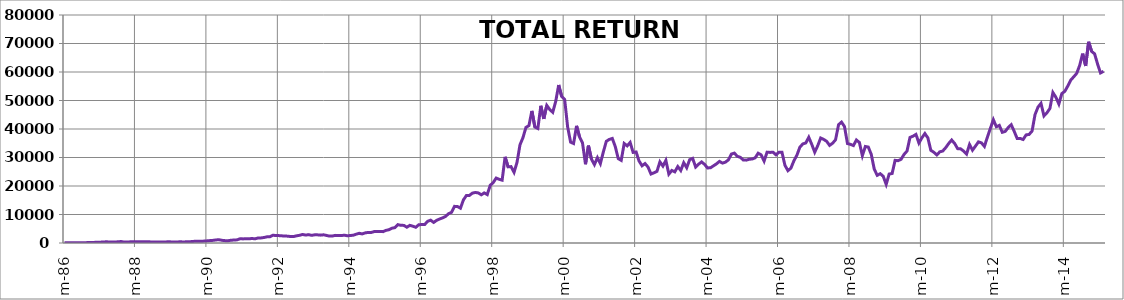
| Category | TOTAL RETURN MICROSOFT |
|---|---|
| 1986-03-13 | 100 |
| 1986-04-13 | 102.68 |
| 1986-05-13 | 115.18 |
| 1986-06-13 | 112.5 |
| 1986-07-13 | 100 |
| 1986-08-13 | 106.25 |
| 1986-09-13 | 100.89 |
| 1986-10-13 | 118.75 |
| 1986-11-13 | 150.45 |
| 1986-12-13 | 168.75 |
| 1987-01-13 | 214.29 |
| 1987-02-13 | 271.43 |
| 1987-03-13 | 295.54 |
| 1987-04-13 | 330.36 |
| 1987-05-13 | 434.82 |
| 1987-06-13 | 350.89 |
| 1987-07-13 | 354.46 |
| 1987-08-13 | 367.86 |
| 1987-09-13 | 415.18 |
| 1987-10-13 | 523.21 |
| 1987-11-13 | 344.64 |
| 1987-12-13 | 342.86 |
| 1988-01-13 | 405.36 |
| 1988-02-13 | 394.64 |
| 1988-03-13 | 446.43 |
| 1988-04-13 | 407.14 |
| 1988-05-13 | 405.36 |
| 1988-06-13 | 445.54 |
| 1988-07-13 | 476.79 |
| 1988-08-13 | 371.43 |
| 1988-09-13 | 385.71 |
| 1988-10-13 | 367.86 |
| 1988-11-13 | 340.18 |
| 1988-12-13 | 341.07 |
| 1989-01-13 | 378.57 |
| 1989-02-13 | 437.5 |
| 1989-03-13 | 376.79 |
| 1989-04-13 | 348.21 |
| 1989-05-13 | 387.5 |
| 1989-06-13 | 408.93 |
| 1989-07-13 | 378.57 |
| 1989-08-13 | 412.5 |
| 1989-09-13 | 444.64 |
| 1989-10-13 | 525 |
| 1989-11-13 | 629.46 |
| 1989-12-13 | 571.43 |
| 1990-01-13 | 615.18 |
| 1990-02-13 | 676.79 |
| 1990-03-13 | 758.93 |
| 1990-04-13 | 862.5 |
| 1990-05-13 | 935.71 |
| 1990-06-13 | 1092.86 |
| 1990-07-13 | 1119.64 |
| 1990-08-13 | 928.57 |
| 1990-09-13 | 821.43 |
| 1990-10-13 | 814.29 |
| 1990-11-13 | 980.36 |
| 1990-12-13 | 1039.29 |
| 1991-01-13 | 1114.29 |
| 1991-02-13 | 1507.14 |
| 1991-03-13 | 1435.71 |
| 1991-04-13 | 1532.14 |
| 1991-05-13 | 1473.21 |
| 1991-06-13 | 1585.71 |
| 1991-07-13 | 1457.07 |
| 1991-08-13 | 1767.77 |
| 1991-09-13 | 1778.48 |
| 1991-10-13 | 1920.44 |
| 1991-11-13 | 2164.18 |
| 1991-12-13 | 2185.61 |
| 1992-01-13 | 2723.97 |
| 1992-02-13 | 2624.87 |
| 1992-03-13 | 2592.73 |
| 1992-04-13 | 2517.73 |
| 1992-05-13 | 2415.95 |
| 1992-06-13 | 2410.59 |
| 1992-07-13 | 2249.77 |
| 1992-08-13 | 2277.9 |
| 1992-09-13 | 2531 |
| 1992-10-13 | 2707.76 |
| 1992-11-13 | 2997.02 |
| 1992-12-13 | 2776.06 |
| 1993-01-13 | 2932.74 |
| 1993-02-13 | 2687.68 |
| 1993-03-13 | 2860.43 |
| 1993-04-13 | 2856.41 |
| 1993-05-13 | 2755.97 |
| 1993-06-13 | 2872.48 |
| 1993-07-13 | 2659.56 |
| 1993-08-13 | 2418.51 |
| 1993-09-13 | 2454.67 |
| 1993-10-13 | 2675.63 |
| 1993-11-13 | 2631.43 |
| 1993-12-13 | 2615.36 |
| 1994-01-13 | 2743.92 |
| 1994-02-13 | 2531 |
| 1994-03-13 | 2627.42 |
| 1994-04-13 | 2727.85 |
| 1994-05-13 | 3101.48 |
| 1994-06-13 | 3398.77 |
| 1994-07-13 | 3181.82 |
| 1994-08-13 | 3551.43 |
| 1994-09-13 | 3700.08 |
| 1994-10-13 | 3679.99 |
| 1994-11-13 | 4001.39 |
| 1994-12-13 | 4033.53 |
| 1995-01-13 | 4033.53 |
| 1995-02-13 | 3985.32 |
| 1995-03-13 | 4435.27 |
| 1995-04-13 | 4660.25 |
| 1995-05-13 | 5190.55 |
| 1995-06-13 | 5391.42 |
| 1995-07-13 | 6435.96 |
| 1995-08-13 | 6202.95 |
| 1995-09-13 | 6178.84 |
| 1995-10-13 | 5544.09 |
| 1995-11-13 | 6190.9 |
| 1995-12-13 | 5897.62 |
| 1996-01-13 | 5511.95 |
| 1996-02-13 | 6403.82 |
| 1996-03-13 | 6484.17 |
| 1996-04-13 | 6500.24 |
| 1996-05-13 | 7625.13 |
| 1996-06-13 | 8010.8 |
| 1996-07-13 | 7223.38 |
| 1996-08-13 | 7938.49 |
| 1996-09-13 | 8420.59 |
| 1996-10-13 | 8814.3 |
| 1996-11-13 | 9320.5 |
| 1996-12-13 | 10284.68 |
| 1997-01-13 | 10766.78 |
| 1997-02-13 | 12855.86 |
| 1997-03-13 | 12807.64 |
| 1997-04-13 | 12213.06 |
| 1997-05-13 | 15137.77 |
| 1997-06-13 | 16664.4 |
| 1997-07-13 | 16680.47 |
| 1997-08-13 | 17492 |
| 1997-09-13 | 17733.05 |
| 1997-10-13 | 17580.38 |
| 1997-11-13 | 16913.48 |
| 1997-12-13 | 17580.38 |
| 1998-01-13 | 16985.8 |
| 1998-02-13 | 20247.97 |
| 1998-03-13 | 21180.02 |
| 1998-04-13 | 22787 |
| 1998-05-13 | 22353.12 |
| 1998-06-13 | 22047.79 |
| 1998-07-13 | 30227.33 |
| 1998-08-13 | 26724.11 |
| 1998-09-13 | 26804.46 |
| 1998-10-13 | 24795.73 |
| 1998-11-13 | 28282.88 |
| 1998-12-13 | 34453.7 |
| 1999-01-13 | 36976.66 |
| 1999-02-13 | 40560.23 |
| 1999-03-13 | 41186.95 |
| 1999-04-13 | 46345.36 |
| 1999-05-13 | 40688.79 |
| 1999-06-13 | 40174.55 |
| 1999-07-13 | 48145.18 |
| 1999-08-13 | 43549.21 |
| 1999-09-13 | 48273.74 |
| 1999-10-13 | 46827.46 |
| 1999-11-13 | 45863.27 |
| 1999-12-13 | 49687.89 |
| 2000-01-13 | 55440.88 |
| 2000-02-13 | 51391.29 |
| 2000-03-13 | 50394.96 |
| 2000-04-13 | 40753.07 |
| 2000-05-13 | 35385.75 |
| 2000-06-13 | 34903.65 |
| 2000-07-13 | 41106.6 |
| 2000-08-13 | 37249.84 |
| 2000-09-13 | 35096.49 |
| 2000-10-13 | 27640.09 |
| 2000-11-13 | 34164.44 |
| 2000-12-13 | 29439.91 |
| 2001-01-13 | 27511.53 |
| 2001-02-13 | 29922 |
| 2001-03-13 | 27865.07 |
| 2001-04-13 | 31975.08 |
| 2001-05-13 | 35687.86 |
| 2001-06-13 | 36351.21 |
| 2001-07-13 | 36685.47 |
| 2001-08-13 | 33852.04 |
| 2001-09-13 | 29609.6 |
| 2001-10-13 | 28992.52 |
| 2001-11-13 | 34916.5 |
| 2001-12-13 | 34078.3 |
| 2002-01-13 | 35281.61 |
| 2002-02-13 | 31789.96 |
| 2002-03-13 | 31933.94 |
| 2002-04-13 | 28761.12 |
| 2002-05-13 | 27095 |
| 2002-06-13 | 27881.77 |
| 2002-07-13 | 26668.18 |
| 2002-08-13 | 24194.71 |
| 2002-09-13 | 24636.96 |
| 2002-10-13 | 25130.63 |
| 2002-11-13 | 28468 |
| 2002-12-13 | 26997.3 |
| 2003-01-13 | 28997.67 |
| 2003-02-13 | 24163.86 |
| 2003-03-13 | 25455.06 |
| 2003-04-13 | 24970.11 |
| 2003-05-13 | 26817.06 |
| 2003-06-13 | 25434.42 |
| 2003-07-13 | 28178.04 |
| 2003-08-13 | 26414.65 |
| 2003-09-13 | 29241.85 |
| 2003-10-13 | 29695.86 |
| 2003-11-13 | 26653.41 |
| 2003-12-13 | 27649.41 |
| 2004-01-13 | 28458.66 |
| 2004-02-13 | 27587.17 |
| 2004-03-13 | 26331.79 |
| 2004-04-13 | 26404.42 |
| 2004-05-13 | 27078.79 |
| 2004-06-13 | 27773.91 |
| 2004-07-13 | 28635.04 |
| 2004-08-13 | 28033.29 |
| 2004-09-13 | 28354.95 |
| 2004-10-13 | 29166.58 |
| 2004-11-13 | 31185.23 |
| 2004-12-13 | 31543.46 |
| 2005-01-13 | 30409.04 |
| 2005-02-13 | 30061.77 |
| 2005-03-13 | 29132.74 |
| 2005-04-13 | 29074.68 |
| 2005-05-13 | 29376.57 |
| 2005-06-13 | 29480.42 |
| 2005-07-13 | 29888.08 |
| 2005-08-13 | 31507.12 |
| 2005-09-13 | 30934.16 |
| 2005-10-13 | 28726.24 |
| 2005-11-13 | 31868.73 |
| 2005-12-13 | 31785.81 |
| 2006-01-13 | 31855.98 |
| 2006-02-13 | 30918.7 |
| 2006-03-13 | 31868.59 |
| 2006-04-13 | 31821.58 |
| 2006-05-13 | 27237.02 |
| 2006-06-13 | 25383.94 |
| 2006-07-13 | 26269.01 |
| 2006-08-13 | 28829.83 |
| 2006-09-13 | 30771.06 |
| 2006-10-13 | 33601.81 |
| 2006-11-13 | 34762.53 |
| 2006-12-13 | 35119.15 |
| 2007-01-13 | 37092.01 |
| 2007-02-13 | 34620.01 |
| 2007-03-13 | 31865.18 |
| 2007-04-13 | 34119.12 |
| 2007-05-13 | 36838.17 |
| 2007-06-13 | 36359.18 |
| 2007-07-13 | 35677.21 |
| 2007-08-13 | 34253.47 |
| 2007-09-13 | 35010.98 |
| 2007-10-13 | 36223.65 |
| 2007-11-13 | 41506.51 |
| 2007-12-13 | 42421.91 |
| 2008-01-13 | 40844.04 |
| 2008-02-13 | 34881.85 |
| 2008-03-13 | 34606.94 |
| 2008-04-13 | 34195.82 |
| 2008-05-13 | 36142.61 |
| 2008-06-13 | 35280.91 |
| 2008-07-13 | 30644.76 |
| 2008-08-13 | 33873.06 |
| 2008-09-13 | 33656.08 |
| 2008-10-13 | 31072.78 |
| 2008-11-13 | 25893.98 |
| 2008-12-13 | 23747.23 |
| 2009-01-13 | 24311.48 |
| 2009-02-13 | 23416.06 |
| 2009-03-13 | 20569.89 |
| 2009-04-13 | 24202.05 |
| 2009-05-13 | 24399.72 |
| 2009-06-13 | 29007.03 |
| 2009-07-13 | 28882.71 |
| 2009-08-13 | 29367.61 |
| 2009-09-13 | 31079.74 |
| 2009-10-13 | 32267.44 |
| 2009-11-13 | 37043.16 |
| 2009-12-13 | 37479.92 |
| 2010-01-13 | 38107.72 |
| 2010-02-13 | 35069.15 |
| 2010-03-13 | 36920.19 |
| 2010-04-13 | 38408.61 |
| 2010-05-13 | 36882.35 |
| 2010-06-13 | 32513.79 |
| 2010-07-13 | 31842.23 |
| 2010-08-13 | 30917.25 |
| 2010-09-13 | 31984.27 |
| 2010-10-13 | 32277.25 |
| 2010-11-13 | 33461.84 |
| 2010-12-13 | 34918.91 |
| 2011-01-13 | 36130.07 |
| 2011-02-13 | 34925.32 |
| 2011-03-13 | 33108.43 |
| 2011-04-13 | 33043.96 |
| 2011-05-13 | 32270.41 |
| 2011-06-13 | 31196.27 |
| 2011-07-13 | 34557.27 |
| 2011-08-13 | 32571.82 |
| 2011-09-13 | 34004.92 |
| 2011-10-13 | 35493.61 |
| 2011-11-13 | 35141.02 |
| 2011-12-13 | 33890.88 |
| 2012-01-13 | 37166.83 |
| 2012-02-13 | 40232.25 |
| 2012-03-13 | 43266.14 |
| 2012-04-13 | 40802.87 |
| 2012-05-13 | 41266.37 |
| 2012-06-13 | 38833.36 |
| 2012-07-13 | 39179.98 |
| 2012-08-13 | 40513.09 |
| 2012-09-13 | 41513.38 |
| 2012-10-13 | 39185.09 |
| 2012-11-13 | 36661.53 |
| 2012-12-13 | 36689.27 |
| 2013-01-13 | 36310.33 |
| 2013-02-13 | 37934.36 |
| 2013-03-13 | 38088.55 |
| 2013-04-13 | 39282.44 |
| 2013-05-13 | 45067.71 |
| 2013-06-13 | 47691.71 |
| 2013-07-13 | 49003.7 |
| 2013-08-13 | 44593.78 |
| 2013-09-13 | 45700.67 |
| 2013-10-13 | 47222.63 |
| 2013-11-13 | 52791.68 |
| 2013-12-13 | 51151.55 |
| 2014-01-13 | 48767.56 |
| 2014-02-13 | 52434.18 |
| 2014-03-13 | 53219.82 |
| 2014-04-13 | 55072.48 |
| 2014-05-13 | 57166.71 |
| 2014-06-13 | 58312.31 |
| 2014-07-13 | 59528.62 |
| 2014-08-13 | 62343.1 |
| 2014-09-13 | 66449.44 |
| 2014-10-13 | 62116.29 |
| 2014-11-13 | 70597.69 |
| 2014-12-13 | 67237.31 |
| 2015-01-13 | 66385.19 |
| 2015-02-13 | 62826.43 |
| 2015-03-13 | 59682.04 |
| 2015-04-13 | 60230.09 |